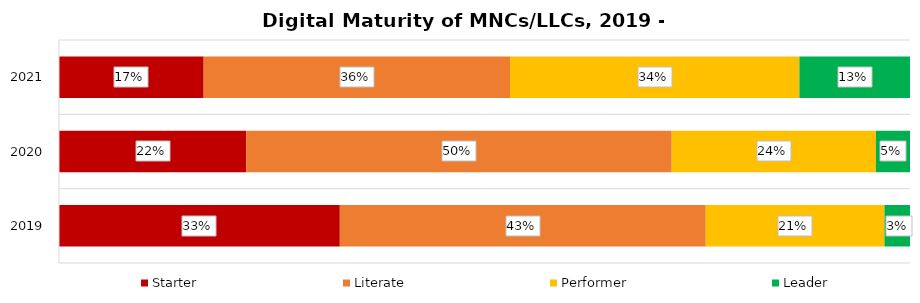
| Category | Starter | Literate | Performer | Leader |
|---|---|---|---|---|
| 2019.0 | 0.33 | 0.43 | 0.21 | 0.03 |
| 2020.0 | 0.22 | 0.5 | 0.24 | 0.05 |
| 2021.0 | 0.17 | 0.36 | 0.34 | 0.13 |